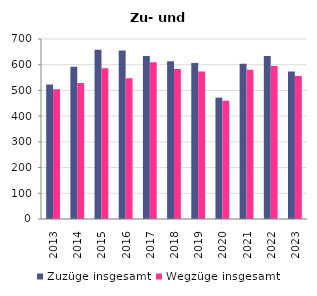
| Category | Zuzüge insgesamt | Wegzüge insgesamt |
|---|---|---|
| 2013.0 | 523 | 505 |
| 2014.0 | 592 | 529 |
| 2015.0 | 658 | 586 |
| 2016.0 | 655 | 547 |
| 2017.0 | 634 | 610 |
| 2018.0 | 613 | 583 |
| 2019.0 | 607 | 574 |
| 2020.0 | 472 | 460 |
| 2021.0 | 604 | 580 |
| 2022.0 | 634 | 595 |
| 2023.0 | 574 | 556 |